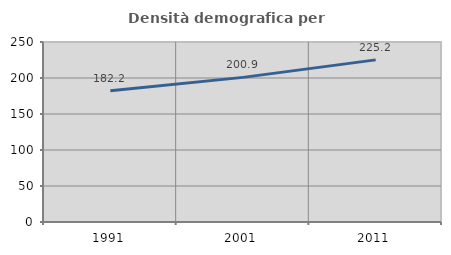
| Category | Densità demografica |
|---|---|
| 1991.0 | 182.222 |
| 2001.0 | 200.875 |
| 2011.0 | 225.185 |